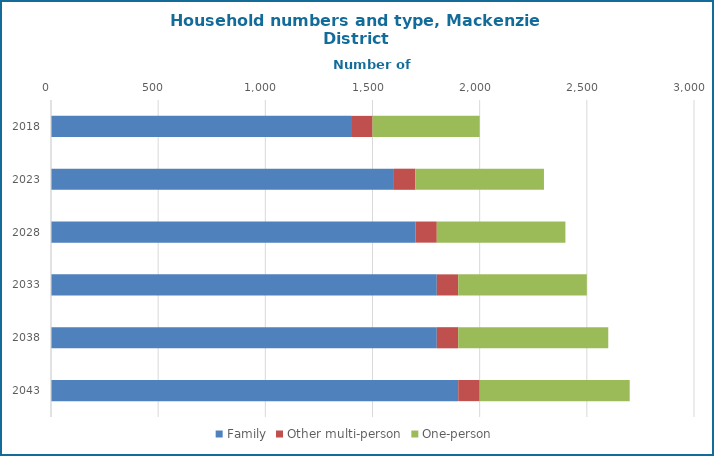
| Category | Family | Other multi-person | One-person |
|---|---|---|---|
| 2018.0 | 1400 | 100 | 500 |
| 2023.0 | 1600 | 100 | 600 |
| 2028.0 | 1700 | 100 | 600 |
| 2033.0 | 1800 | 100 | 600 |
| 2038.0 | 1800 | 100 | 700 |
| 2043.0 | 1900 | 100 | 700 |